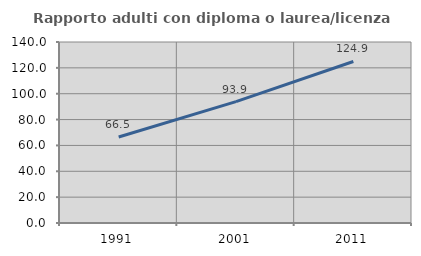
| Category | Rapporto adulti con diploma o laurea/licenza media  |
|---|---|
| 1991.0 | 66.482 |
| 2001.0 | 93.921 |
| 2011.0 | 124.927 |